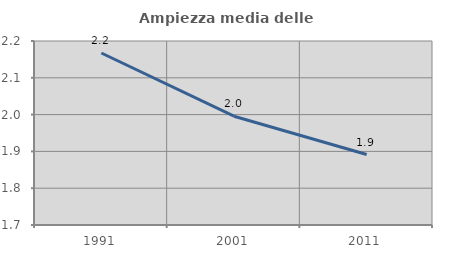
| Category | Ampiezza media delle famiglie |
|---|---|
| 1991.0 | 2.167 |
| 2001.0 | 1.996 |
| 2011.0 | 1.892 |